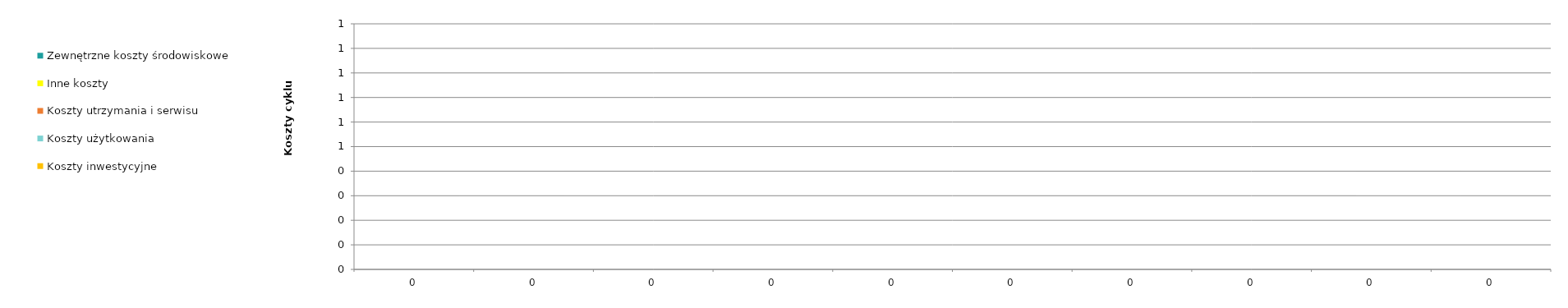
| Category | Koszty inwestycyjne  | Koszty użytkowania | Koszty utrzymania i serwisu | Inne koszty | Zewnętrzne koszty środowiskowe |
|---|---|---|---|---|---|
| 0.0 | 0 | 0 | 0 | 0 | 0 |
| 0.0 | 0 | 0 | 0 | 0 | 0 |
| 0.0 | 0 | 0 | 0 | 0 | 0 |
| 0.0 | 0 | 0 | 0 | 0 | 0 |
| 0.0 | 0 | 0 | 0 | 0 | 0 |
| 0.0 | 0 | 0 | 0 | 0 | 0 |
| 0.0 | 0 | 0 | 0 | 0 | 0 |
| 0.0 | 0 | 0 | 0 | 0 | 0 |
| 0.0 | 0 | 0 | 0 | 0 | 0 |
| 0.0 | 0 | 0 | 0 | 0 | 0 |